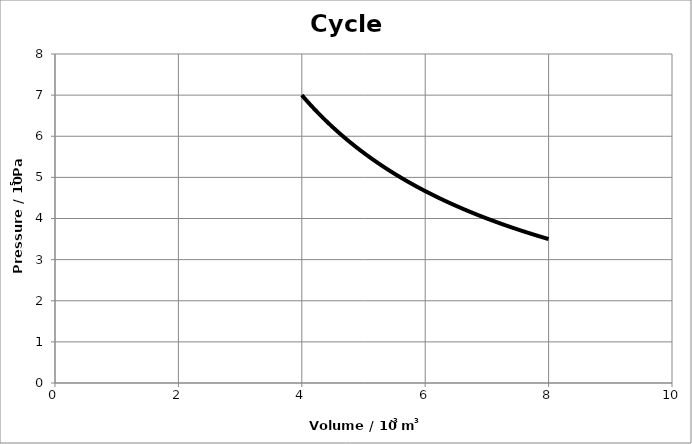
| Category | Series 0 |
|---|---|
| 4.0 | 7 |
| 4.04 | 6.931 |
| 4.08 | 6.863 |
| 4.12 | 6.796 |
| 4.16 | 6.731 |
| 4.2 | 6.667 |
| 4.24 | 6.604 |
| 4.28 | 6.542 |
| 4.32 | 6.481 |
| 4.36 | 6.422 |
| 4.4 | 6.364 |
| 4.44 | 6.306 |
| 4.48 | 6.25 |
| 4.5200000000000005 | 6.195 |
| 4.5600000000000005 | 6.14 |
| 4.6000000000000005 | 6.087 |
| 4.640000000000001 | 6.034 |
| 4.680000000000001 | 5.983 |
| 4.720000000000001 | 5.932 |
| 4.760000000000001 | 5.882 |
| 4.800000000000001 | 5.833 |
| 4.840000000000001 | 5.785 |
| 4.880000000000001 | 5.738 |
| 4.920000000000001 | 5.691 |
| 4.960000000000001 | 5.645 |
| 5.000000000000001 | 5.6 |
| 5.040000000000001 | 5.556 |
| 5.080000000000001 | 5.512 |
| 5.120000000000001 | 5.469 |
| 5.160000000000001 | 5.426 |
| 5.200000000000001 | 5.385 |
| 5.240000000000001 | 5.344 |
| 5.280000000000001 | 5.303 |
| 5.320000000000001 | 5.263 |
| 5.360000000000001 | 5.224 |
| 5.400000000000001 | 5.185 |
| 5.440000000000001 | 5.147 |
| 5.480000000000001 | 5.109 |
| 5.520000000000001 | 5.072 |
| 5.560000000000001 | 5.036 |
| 5.600000000000001 | 5 |
| 5.6400000000000015 | 4.965 |
| 5.6800000000000015 | 4.93 |
| 5.7200000000000015 | 4.895 |
| 5.760000000000002 | 4.861 |
| 5.800000000000002 | 4.828 |
| 5.840000000000002 | 4.795 |
| 5.880000000000002 | 4.762 |
| 5.920000000000002 | 4.73 |
| 5.960000000000002 | 4.698 |
| 6.000000000000002 | 4.667 |
| 6.040000000000002 | 4.636 |
| 6.080000000000002 | 4.605 |
| 6.120000000000002 | 4.575 |
| 6.160000000000002 | 4.545 |
| 6.200000000000002 | 4.516 |
| 6.240000000000002 | 4.487 |
| 6.280000000000002 | 4.459 |
| 6.320000000000002 | 4.43 |
| 6.360000000000002 | 4.403 |
| 6.400000000000002 | 4.375 |
| 6.440000000000002 | 4.348 |
| 6.480000000000002 | 4.321 |
| 6.520000000000002 | 4.294 |
| 6.560000000000002 | 4.268 |
| 6.600000000000002 | 4.242 |
| 6.640000000000002 | 4.217 |
| 6.680000000000002 | 4.192 |
| 6.720000000000002 | 4.167 |
| 6.7600000000000025 | 4.142 |
| 6.8000000000000025 | 4.118 |
| 6.8400000000000025 | 4.094 |
| 6.880000000000003 | 4.07 |
| 6.920000000000003 | 4.046 |
| 6.960000000000003 | 4.023 |
| 7.000000000000003 | 4 |
| 7.040000000000003 | 3.977 |
| 7.080000000000003 | 3.955 |
| 7.120000000000003 | 3.933 |
| 7.160000000000003 | 3.911 |
| 7.200000000000003 | 3.889 |
| 7.240000000000003 | 3.867 |
| 7.280000000000003 | 3.846 |
| 7.320000000000003 | 3.825 |
| 7.360000000000003 | 3.804 |
| 7.400000000000003 | 3.784 |
| 7.440000000000003 | 3.763 |
| 7.480000000000003 | 3.743 |
| 7.520000000000003 | 3.723 |
| 7.560000000000003 | 3.704 |
| 7.600000000000003 | 3.684 |
| 7.640000000000003 | 3.665 |
| 7.680000000000003 | 3.646 |
| 7.720000000000003 | 3.627 |
| 7.760000000000003 | 3.608 |
| 7.800000000000003 | 3.59 |
| 7.840000000000003 | 3.571 |
| 7.8800000000000034 | 3.553 |
| 7.9200000000000035 | 3.535 |
| 7.9600000000000035 | 3.518 |
| 8.000000000000004 | 3.5 |